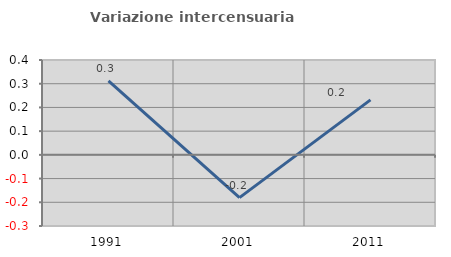
| Category | Variazione intercensuaria annua |
|---|---|
| 1991.0 | 0.312 |
| 2001.0 | -0.18 |
| 2011.0 | 0.232 |